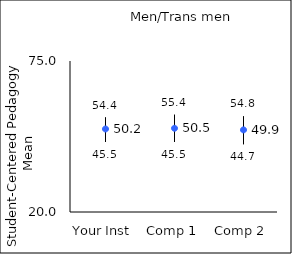
| Category | 25th percentile | 75th percentile | Mean |
|---|---|---|---|
| Your Inst | 45.5 | 54.4 | 50.24 |
| Comp 1 | 45.5 | 55.4 | 50.5 |
| Comp 2 | 44.7 | 54.8 | 49.91 |